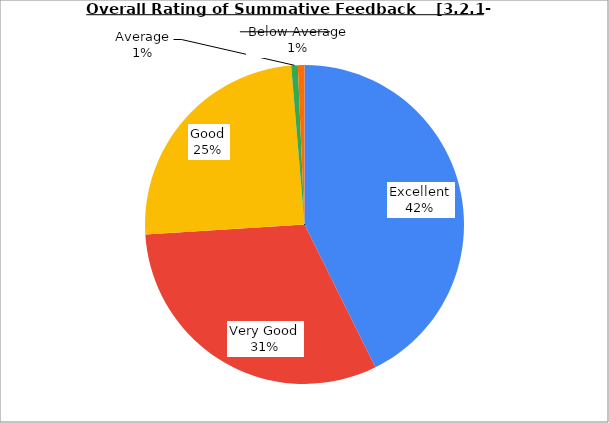
| Category | Series 0 |
|---|---|
| Excellent | 42.667 |
| Very Good | 31.333 |
| Good | 24.667 |
| Average | 0.667 |
| Below Average | 0.667 |